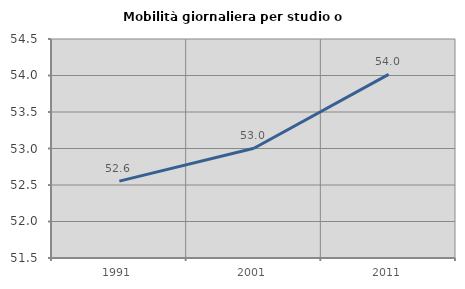
| Category | Mobilità giornaliera per studio o lavoro |
|---|---|
| 1991.0 | 52.553 |
| 2001.0 | 53.003 |
| 2011.0 | 54.016 |